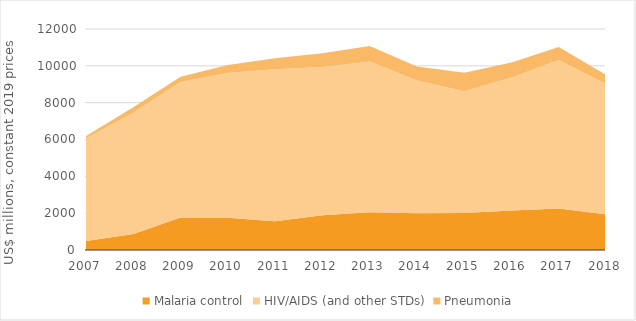
| Category | Malaria control | HIV/AIDS (and other STDs) | Pneumonia |
|---|---|---|---|
| 2007.0 | 494.908 | 5556.654 | 140.461 |
| 2008.0 | 871.687 | 6575.918 | 307.084 |
| 2009.0 | 1760.283 | 7367.393 | 277.571 |
| 2010.0 | 1757.409 | 7847.595 | 439.813 |
| 2011.0 | 1554.405 | 8256.17 | 606.857 |
| 2012.0 | 1892.269 | 8047.845 | 748.612 |
| 2013.0 | 2049.316 | 8188.192 | 834.804 |
| 2014.0 | 1996.244 | 7203.978 | 757.394 |
| 2015.0 | 2010.798 | 6607.152 | 1006.371 |
| 2016.0 | 2138.412 | 7226.195 | 813.82 |
| 2017.0 | 2259.498 | 8053.546 | 707.439 |
| 2018.0 | 1934.352 | 7083.642 | 493.508 |